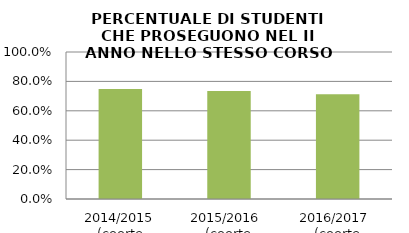
| Category | 2014/2015 (coorte 2013/14) 2015/2016  (coorte 2014/15) 2016/2017  (coorte 2015/16) |
|---|---|
| 2014/2015 (coorte 2013/14) | 0.749 |
| 2015/2016  (coorte 2014/15) | 0.735 |
| 2016/2017  (coorte 2015/16) | 0.713 |